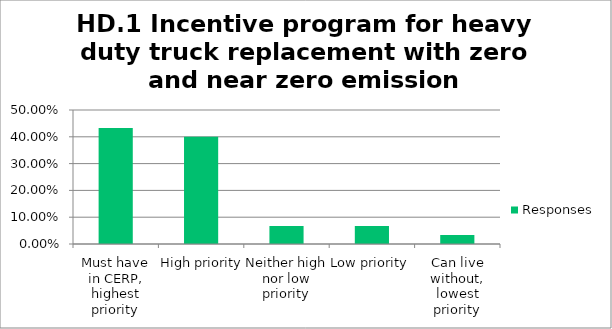
| Category | Responses |
|---|---|
| Must have in CERP, highest priority | 0.433 |
| High priority | 0.4 |
| Neither high nor low priority | 0.067 |
| Low priority | 0.067 |
| Can live without, lowest priority | 0.033 |